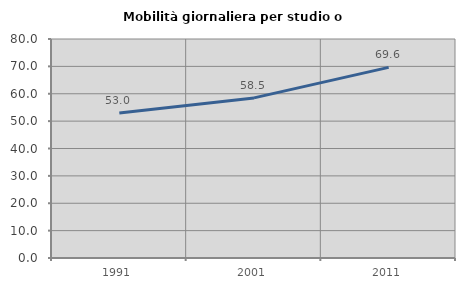
| Category | Mobilità giornaliera per studio o lavoro |
|---|---|
| 1991.0 | 52.961 |
| 2001.0 | 58.486 |
| 2011.0 | 69.635 |